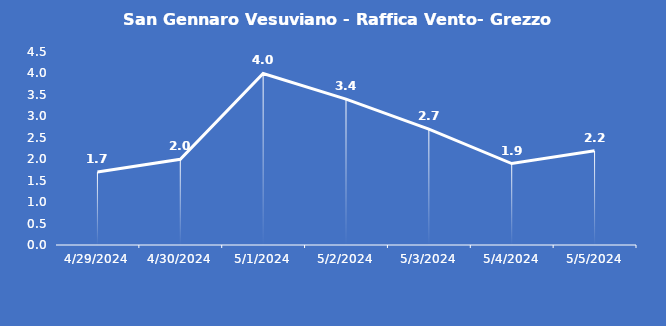
| Category | San Gennaro Vesuviano - Raffica Vento- Grezzo (m/s) |
|---|---|
| 4/29/24 | 1.7 |
| 4/30/24 | 2 |
| 5/1/24 | 4 |
| 5/2/24 | 3.4 |
| 5/3/24 | 2.7 |
| 5/4/24 | 1.9 |
| 5/5/24 | 2.2 |